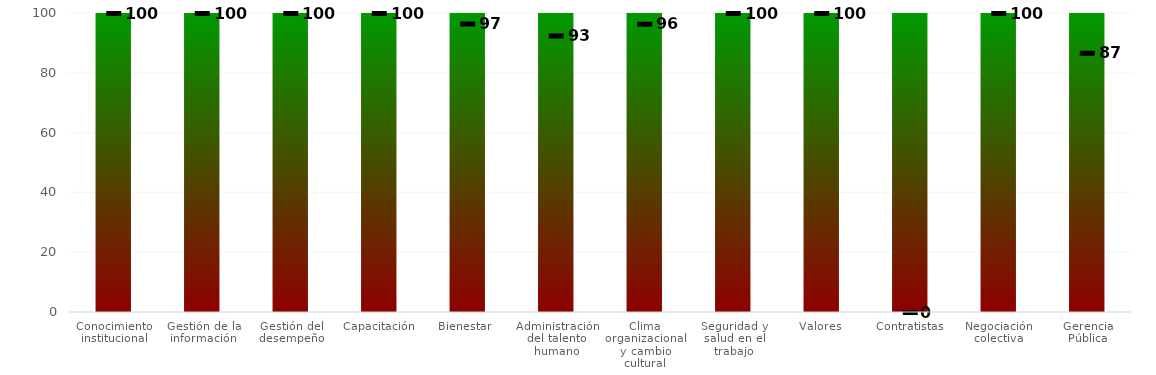
| Category | Niveles |
|---|---|
| Conocimiento institucional | 100 |
| Gestión de la información | 100 |
| Gestión del desempeño | 100 |
| Capacitación | 100 |
| Bienestar  | 100 |
| Administración del talento humano | 100 |
| Clima organizacional y cambio cultural | 100 |
| Seguridad y salud en el trabajo | 100 |
| Valores | 100 |
| Contratistas | 100 |
| Negociación colectiva | 100 |
| Gerencia Pública | 100 |